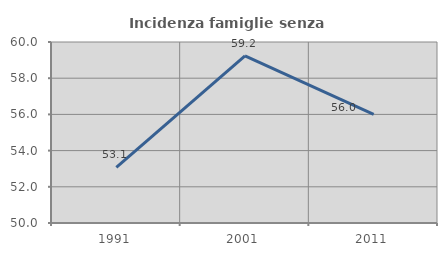
| Category | Incidenza famiglie senza nuclei |
|---|---|
| 1991.0 | 53.077 |
| 2001.0 | 59.231 |
| 2011.0 | 56 |